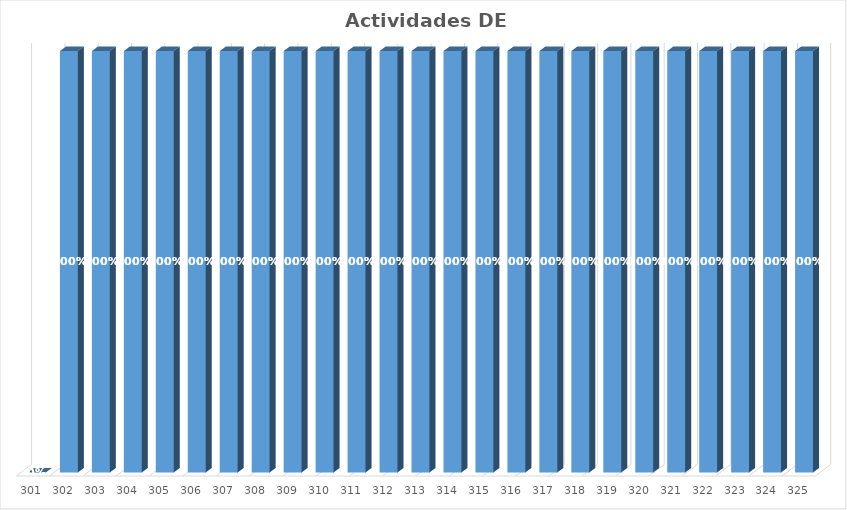
| Category | % Avance |
|---|---|
| 301.0 | 0 |
| 302.0 | 1 |
| 303.0 | 1 |
| 304.0 | 1 |
| 305.0 | 1 |
| 306.0 | 1 |
| 307.0 | 1 |
| 308.0 | 1 |
| 309.0 | 1 |
| 310.0 | 1 |
| 311.0 | 1 |
| 312.0 | 1 |
| 313.0 | 1 |
| 314.0 | 1 |
| 315.0 | 1 |
| 316.0 | 1 |
| 317.0 | 1 |
| 318.0 | 1 |
| 319.0 | 1 |
| 320.0 | 1 |
| 321.0 | 1 |
| 322.0 | 1 |
| 323.0 | 1 |
| 324.0 | 1 |
| 325.0 | 1 |